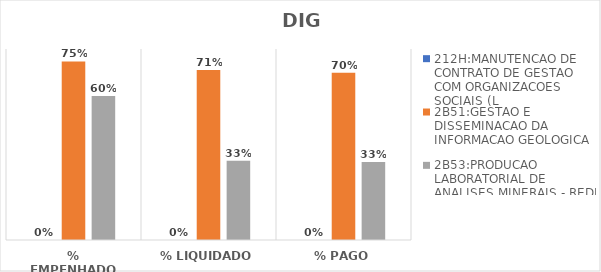
| Category | 212H:MANUTENCAO DE CONTRATO DE GESTAO COM ORGANIZACOES SOCIAIS (L | 2B51:GESTAO E DISSEMINACAO DA INFORMACAO GEOLOGICA | 2B53:PRODUCAO LABORATORIAL DE ANALISES MINERAIS - REDE LAMIN |
|---|---|---|---|
| % EMPENHADO | 0 | 0.748 | 0.603 |
| % LIQUIDADO | 0 | 0.712 | 0.332 |
| % PAGO | 0 | 0.7 | 0.327 |